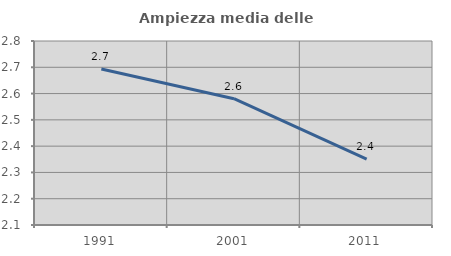
| Category | Ampiezza media delle famiglie |
|---|---|
| 1991.0 | 2.694 |
| 2001.0 | 2.58 |
| 2011.0 | 2.35 |